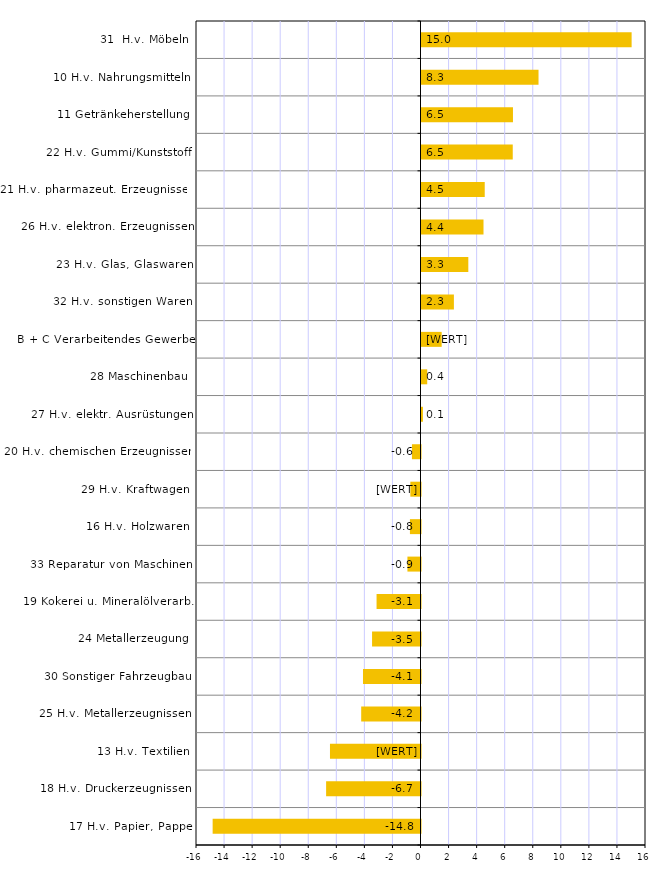
| Category | Series 0 |
|---|---|
| 17 H.v. Papier, Pappe | -14.814 |
| 18 H.v. Druckerzeugnissen | -6.727 |
| 13 H.v. Textilien | -6.452 |
| 25 H.v. Metallerzeugnissen | -4.226 |
| 30 Sonstiger Fahrzeugbau | -4.099 |
| 24 Metallerzeugung | -3.452 |
| 19 Kokerei u. Mineralölverarb. | -3.131 |
| 33 Reparatur von Maschinen | -0.931 |
| 16 H.v. Holzwaren | -0.753 |
| 29 H.v. Kraftwagen | -0.723 |
| 20 H.v. chemischen Erzeugnissen | -0.61 |
| 27 H.v. elektr. Ausrüstungen | 0.1 |
| 28 Maschinenbau | 0.408 |
| B + C Verarbeitendes Gewerbe | 1.437 |
| 32 H.v. sonstigen Waren | 2.309 |
| 23 H.v. Glas, Glaswaren | 3.337 |
| 26 H.v. elektron. Erzeugnissen | 4.419 |
| 21 H.v. pharmazeut. Erzeugnissen | 4.506 |
| 22 H.v. Gummi/Kunststoff | 6.503 |
| 11 Getränkeherstellung | 6.519 |
| 10 H.v. Nahrungsmitteln | 8.34 |
| 31  H.v. Möbeln | 14.975 |